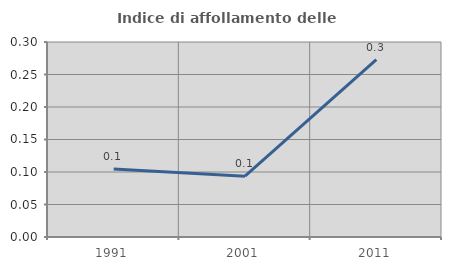
| Category | Indice di affollamento delle abitazioni  |
|---|---|
| 1991.0 | 0.105 |
| 2001.0 | 0.094 |
| 2011.0 | 0.273 |